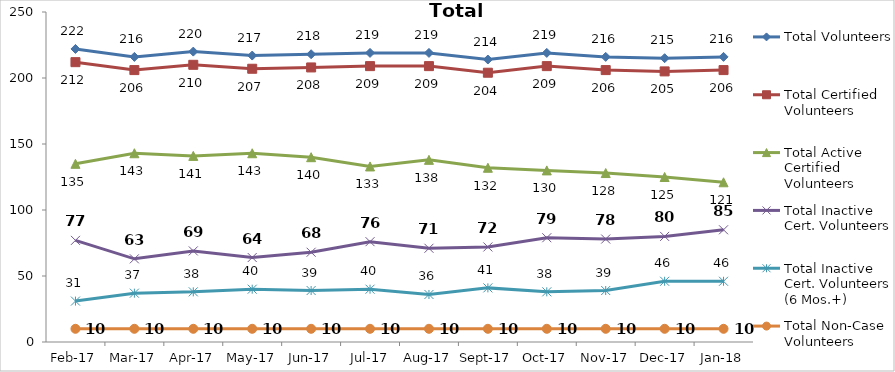
| Category | Total Volunteers | Total Certified Volunteers | Total Active Certified Volunteers | Total Inactive Cert. Volunteers | Total Inactive Cert. Volunteers (6 Mos.+) | Total Non-Case Volunteers |
|---|---|---|---|---|---|---|
| 2017-02-01 | 222 | 212 | 135 | 77 | 31 | 10 |
| 2017-03-01 | 216 | 206 | 143 | 63 | 37 | 10 |
| 2017-04-01 | 220 | 210 | 141 | 69 | 38 | 10 |
| 2017-05-01 | 217 | 207 | 143 | 64 | 40 | 10 |
| 2017-06-01 | 218 | 208 | 140 | 68 | 39 | 10 |
| 2017-07-01 | 219 | 209 | 133 | 76 | 40 | 10 |
| 2017-08-01 | 219 | 209 | 138 | 71 | 36 | 10 |
| 2017-09-01 | 214 | 204 | 132 | 72 | 41 | 10 |
| 2017-10-01 | 219 | 209 | 130 | 79 | 38 | 10 |
| 2017-11-01 | 216 | 206 | 128 | 78 | 39 | 10 |
| 2017-12-01 | 215 | 205 | 125 | 80 | 46 | 10 |
| 2018-01-01 | 216 | 206 | 121 | 85 | 46 | 10 |